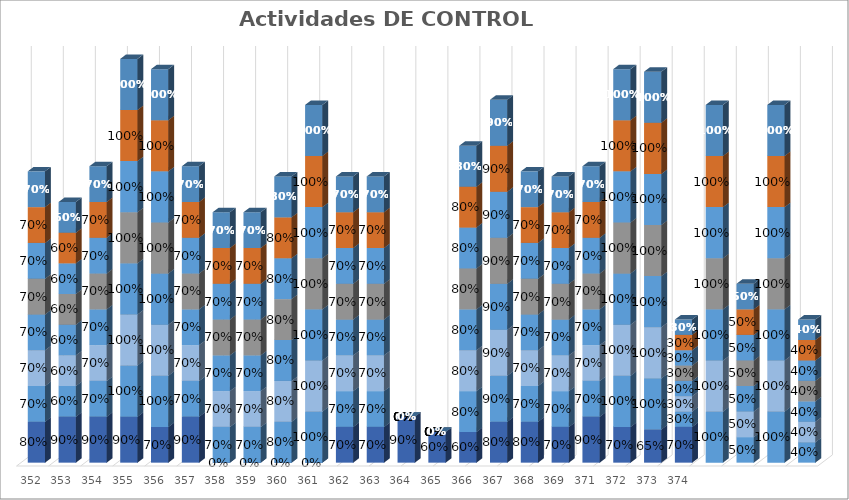
| Category | % Avance |
|---|---|
| 352.0 | 0.7 |
| 353.0 | 0.6 |
| 354.0 | 0.7 |
| 355.0 | 1 |
| 356.0 | 1 |
| 357.0 | 0.7 |
| 358.0 | 0.7 |
| 359.0 | 0.7 |
| 360.0 | 0.8 |
| 361.0 | 1 |
| 362.0 | 0.7 |
| 363.0 | 0.7 |
| 364.0 | 0 |
| 365.0 | 0 |
| 366.0 | 0.8 |
| 367.0 | 0.9 |
| 368.0 | 0.7 |
| 369.0 | 0.7 |
| 371.0 | 0.7 |
| 372.0 | 1 |
| 373.0 | 1 |
| 374.0 | 0.3 |